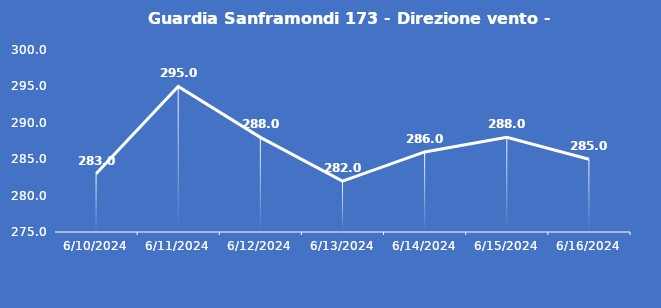
| Category | Guardia Sanframondi 173 - Direzione vento - Grezzo (°N) |
|---|---|
| 6/10/24 | 283 |
| 6/11/24 | 295 |
| 6/12/24 | 288 |
| 6/13/24 | 282 |
| 6/14/24 | 286 |
| 6/15/24 | 288 |
| 6/16/24 | 285 |